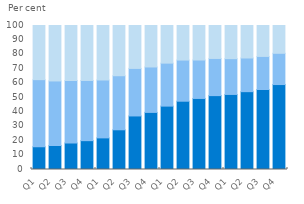
| Category | ATM | OTC | Night safe |
|---|---|---|---|
| Q1 | 15.789 | 46.602 | 37.609 |
| Q2 | 16.658 | 44.826 | 38.516 |
| Q3 | 18.425 | 43.388 | 38.187 |
| Q4 | 20.032 | 41.808 | 38.161 |
| Q1 | 21.96 | 40.201 | 37.839 |
| Q2 | 27.584 | 37.528 | 34.888 |
| Q3 | 37.19 | 33.009 | 29.801 |
| Q4 | 39.65 | 31.55 | 28.8 |
| Q1 | 44.019 | 29.849 | 26.131 |
| Q2 | 47.423 | 28.579 | 23.998 |
| Q3 | 49.344 | 26.69 | 23.966 |
| Q4 | 51.306 | 25.81 | 22.884 |
| Q1 | 52.126 | 24.848 | 23.026 |
| Q2 | 54.053 | 23.384 | 22.563 |
| Q3 | 55.538 | 22.989 | 21.473 |
| Q4 | 58.995 | 21.702 | 19.303 |